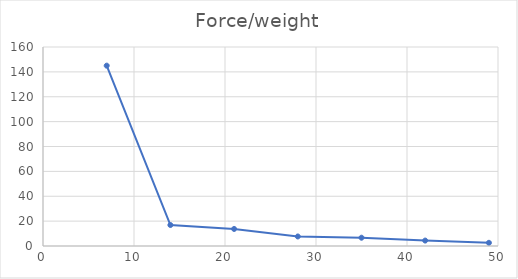
| Category | Force/weight |
|---|---|
| 7.0 | 145 |
| 14.0 | 16.87 |
| 21.0 | 13.7 |
| 28.0 | 7.659 |
| 35.0 | 6.663 |
| 42.0 | 4.372 |
| 49.0 | 2.559 |